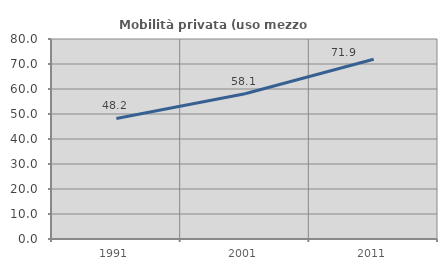
| Category | Mobilità privata (uso mezzo privato) |
|---|---|
| 1991.0 | 48.219 |
| 2001.0 | 58.104 |
| 2011.0 | 71.91 |